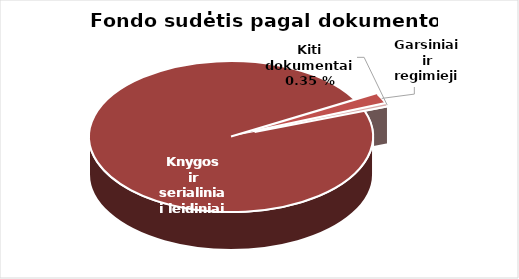
| Category | Series 0 |
|---|---|
| Knygos ir serialiniai | 651283 |
| Garsiniai ir regimieji | 14004 |
| Kiti dokumentai | 3447 |